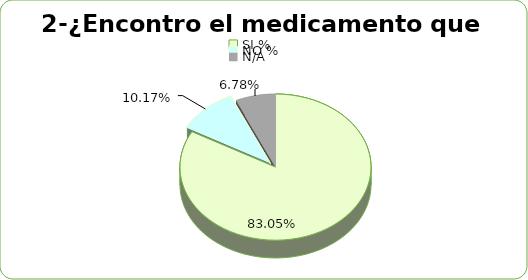
| Category | Series 0 |
|---|---|
| SI % | 0.831 |
| NO % | 0.102 |
| N/A | 0.068 |